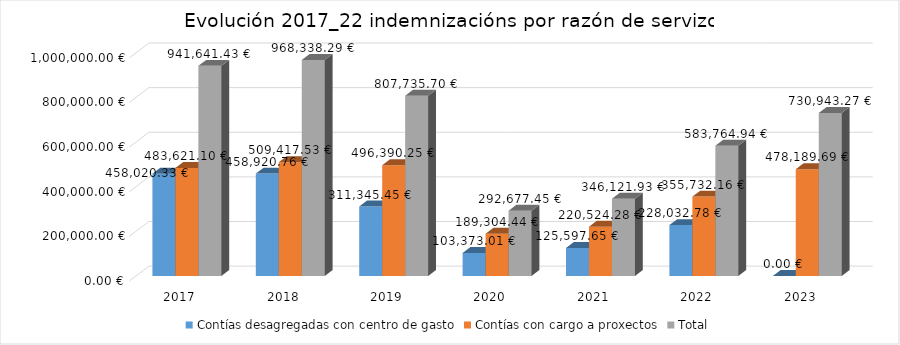
| Category | Contías desagregadas con centro de gasto | Contías con cargo a proxectos | Total |
|---|---|---|---|
| 2017.0 | 458020.33 | 483621.1 | 941641.43 |
| 2018.0 | 458920.76 | 509417.53 | 968338.29 |
| 2019.0 | 311345.45 | 496390.25 | 807735.7 |
| 2020.0 | 103373.01 | 189304.44 | 292677.45 |
| 2021.0 | 125597.65 | 220524.28 | 346121.93 |
| 2022.0 | 228032.78 | 355732.16 | 583764.94 |
| 2023.0 | 0 | 478189.69 | 730943.27 |